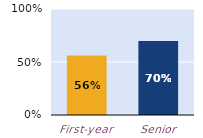
| Category | substantially |
|---|---|
| First-year | 0.561 |
| Senior | 0.698 |